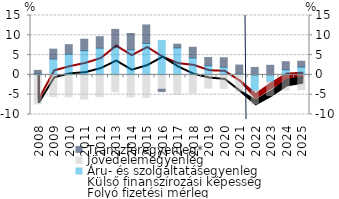
| Category | Áru- és szolgáltatásegyenleg | Jövedelemegyenleg | Transzferegyenleg* |
|---|---|---|---|
| 2008.0 | 0.347 | -7.341 | 0.795 |
| 2009.0 | 4.021 | -5.478 | 2.483 |
| 2010.0 | 5.256 | -5.542 | 2.369 |
| 2011.0 | 6.11 | -6.105 | 2.903 |
| 2012.0 | 6.752 | -5.517 | 2.896 |
| 2013.0 | 6.971 | -4.229 | 4.521 |
| 2014.0 | 6.316 | -5.598 | 4.145 |
| 2015.0 | 7.94 | -5.691 | 4.671 |
| 2016.0 | 8.675 | -3.642 | -0.569 |
| 2017.0 | 6.819 | -4.916 | 0.941 |
| 2018.0 | 4.262 | -4.583 | 2.731 |
| 2019.0 | 2.326 | -3.326 | 2.061 |
| 2020.0 | 1.937 | -3.433 | 2.39 |
| 2021.0 | 0.304 | -4.107 | 2.177 |
| 2022.0 | -3.982 | -3.365 | 1.879 |
| 2023.0 | -1.653 | -3.568 | 2.426 |
| 2024.0 | 1.3 | -3.825 | 2.031 |
| 2025.0 | 1.985 | -3.718 | 1.461 |